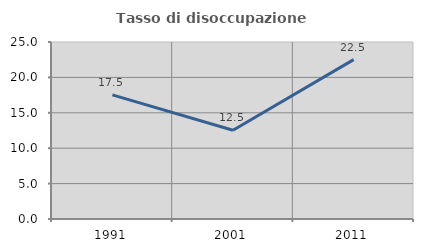
| Category | Tasso di disoccupazione giovanile  |
|---|---|
| 1991.0 | 17.528 |
| 2001.0 | 12.536 |
| 2011.0 | 22.511 |